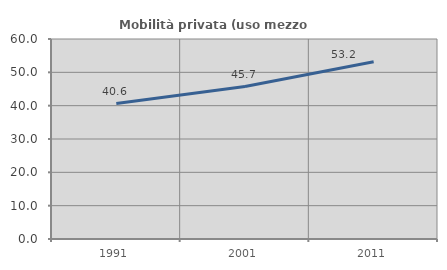
| Category | Mobilità privata (uso mezzo privato) |
|---|---|
| 1991.0 | 40.639 |
| 2001.0 | 45.724 |
| 2011.0 | 53.151 |